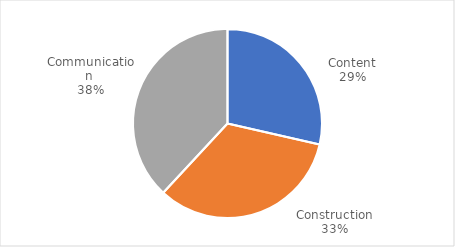
| Category | Series 0 |
|---|---|
| Content | 3 |
| Construction | 3.5 |
| Communication  | 4 |